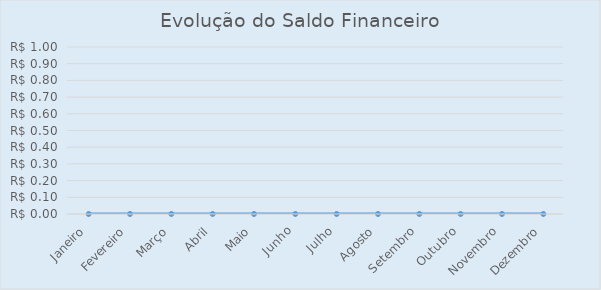
| Category | Series 0 |
|---|---|
| Janeiro | 0 |
| Fevereiro | 0 |
| Março | 0 |
| Abril | 0 |
| Maio | 0 |
| Junho | 0 |
| Julho | 0 |
| Agosto | 0 |
| Setembro | 0 |
| Outubro | 0 |
| Novembro | 0 |
| Dezembro | 0 |